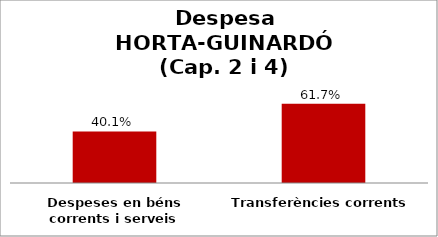
| Category | Series 0 |
|---|---|
| Despeses en béns corrents i serveis | 0.401 |
| Transferències corrents | 0.617 |